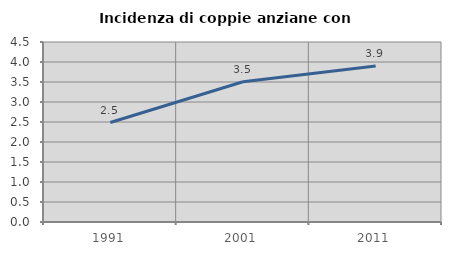
| Category | Incidenza di coppie anziane con figli |
|---|---|
| 1991.0 | 2.487 |
| 2001.0 | 3.506 |
| 2011.0 | 3.901 |